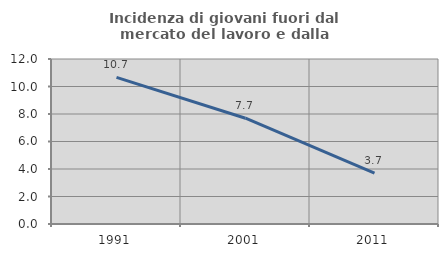
| Category | Incidenza di giovani fuori dal mercato del lavoro e dalla formazione  |
|---|---|
| 1991.0 | 10.667 |
| 2001.0 | 7.692 |
| 2011.0 | 3.704 |